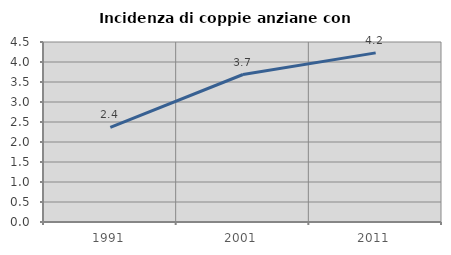
| Category | Incidenza di coppie anziane con figli |
|---|---|
| 1991.0 | 2.365 |
| 2001.0 | 3.687 |
| 2011.0 | 4.228 |